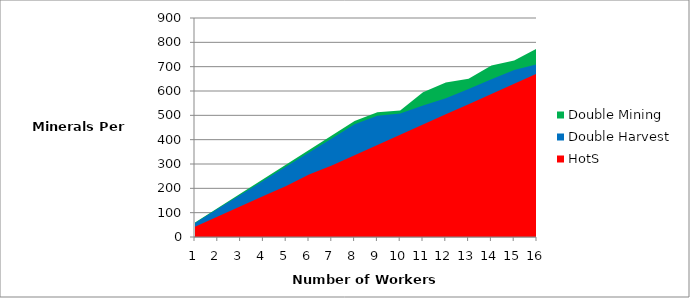
| Category | Double Mining | Double Harvest | HotS |
|---|---|---|---|
| 0 | 59.6 | 57.9 | 42 |
| 1 | 119.2 | 115.8 | 84 |
| 2 | 178.8 | 173.7 | 126 |
| 3 | 238.4 | 231.6 | 168 |
| 4 | 298 | 289.5 | 210 |
| 5 | 357.6 | 347.4 | 257 |
| 6 | 417.2 | 405.3 | 294 |
| 7 | 476.8 | 463.3 | 336 |
| 8 | 513 | 498 | 378 |
| 9 | 520 | 508 | 420 |
| 10 | 595 | 540 | 462 |
| 11 | 635 | 570 | 504 |
| 12 | 650 | 608 | 546 |
| 13 | 705 | 648 | 588 |
| 14 | 725 | 686 | 630 |
| 15 | 775 | 710 | 672 |